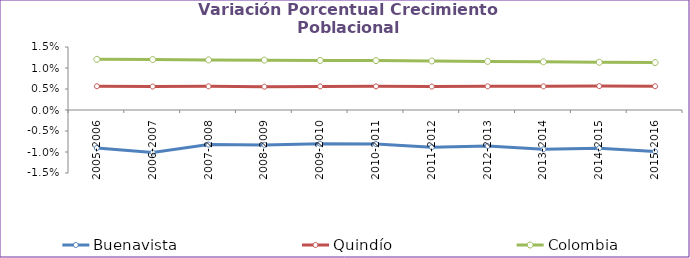
| Category | Buenavista | Quindío | Colombia |
|---|---|---|---|
| 2005-2006 | -0.009 | 0.006 | 0.012 |
| 2006-2007 | -0.01 | 0.006 | 0.012 |
| 2007-2008 | -0.008 | 0.006 | 0.012 |
| 2008-2009 | -0.008 | 0.006 | 0.012 |
| 2009-2010 | -0.008 | 0.006 | 0.012 |
| 2010-2011 | -0.008 | 0.006 | 0.012 |
| 2011-2012 | -0.009 | 0.006 | 0.012 |
| 2012-2013 | -0.009 | 0.006 | 0.012 |
| 2013-2014 | -0.009 | 0.006 | 0.011 |
| 2014-2015 | -0.009 | 0.006 | 0.011 |
| 2015-2016 | -0.01 | 0.006 | 0.011 |